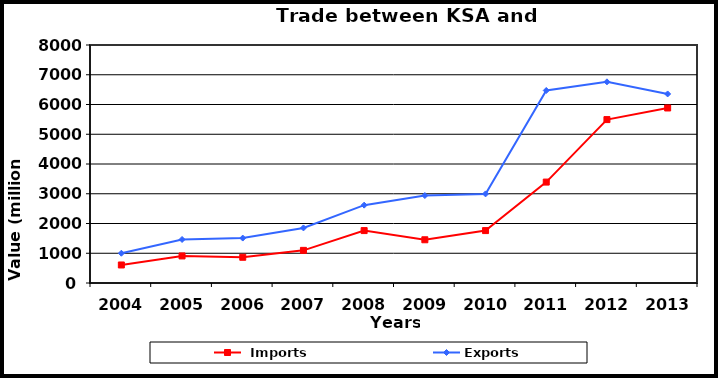
| Category |  Imports | Exports |
|---|---|---|
| 2004.0 | 606 | 1001 |
| 2005.0 | 910 | 1463 |
| 2006.0 | 865 | 1510 |
| 2007.0 | 1097 | 1851 |
| 2008.0 | 1762 | 2617 |
| 2009.0 | 1453 | 2940 |
| 2010.0 | 1762 | 2995 |
| 2011.0 | 3392 | 6471 |
| 2012.0 | 5493 | 6762 |
| 2013.0 | 5883 | 6355 |